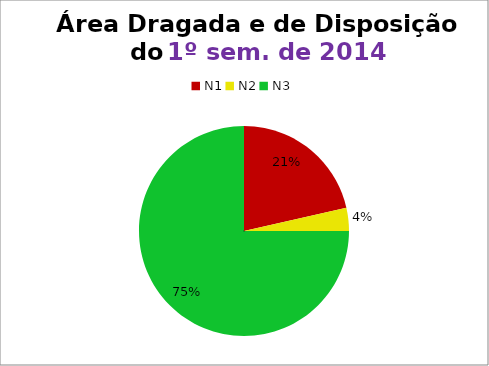
| Category | 1º/14 |
|---|---|
| N1 | 6 |
| N2 | 1 |
| N3 | 21 |